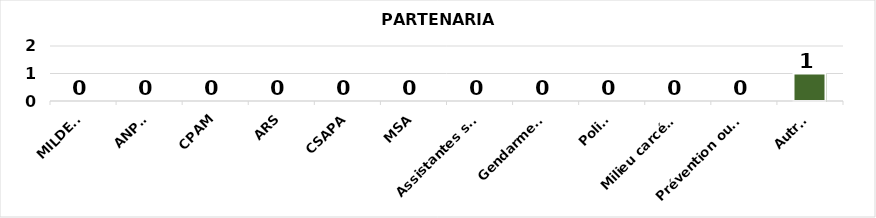
| Category | Series 0 |
|---|---|
| MILDECA | 0 |
| ANPAA | 0 |
| CPAM | 0 |
| ARS | 0 |
| CSAPA | 0 |
| MSA | 0 |
| Assistantes sociales | 0 |
| Gendarmerie | 0 |
| Police | 0 |
| Milieu carcéral | 0 |
| Prévention ou sécurité routière | 0 |
| Autres | 1 |